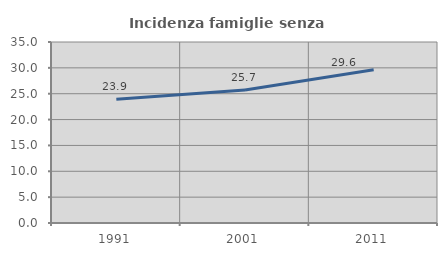
| Category | Incidenza famiglie senza nuclei |
|---|---|
| 1991.0 | 23.934 |
| 2001.0 | 25.698 |
| 2011.0 | 29.62 |